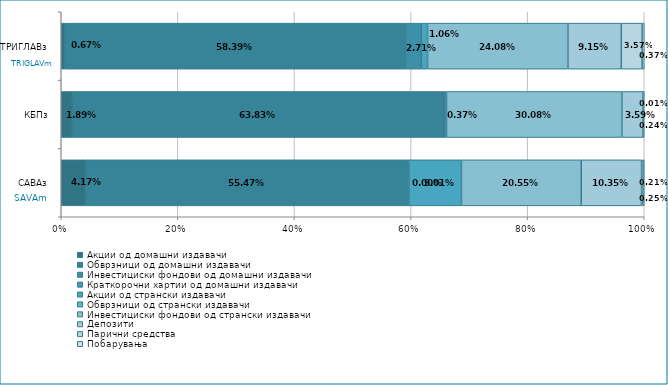
| Category | Акции од домашни издавачи  | Обврзници од домашни издавачи  | Инвестициски фондови од домашни издавачи  | Краткорочни хартии од домашни издавачи  | Акции од странски издавачи  | Обврзници од странски издавачи  | Инвестициски фондови од странски издавaчи | Депозити  | Парични средства  | Побарувања |
|---|---|---|---|---|---|---|---|---|---|---|
| САВАз | 0.042 | 0.555 | 0 | 0 | 0.09 | 0 | 0.205 | 0.103 | 0.002 | 0.002 |
| КБПз | 0.019 | 0.638 | 0.004 | 0 | 0 | 0 | 0.301 | 0.036 | 0 | 0.002 |
| ТРИГЛАВз | 0.007 | 0.584 | 0.027 | 0 | 0.011 | 0 | 0.241 | 0.092 | 0.036 | 0.004 |